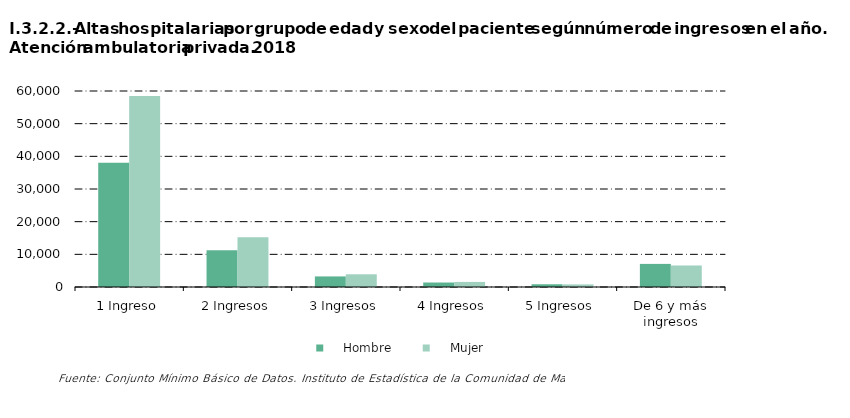
| Category |     Hombre |     Mujer |
|---|---|---|
| 1 Ingreso | 38058 | 58470 |
| 2 Ingresos | 11274 | 15250 |
| 3 Ingresos | 3237 | 3892 |
| 4 Ingresos | 1374 | 1557 |
| 5 Ingresos | 840 | 798 |
| De 6 y más ingresos | 7072 | 6587 |